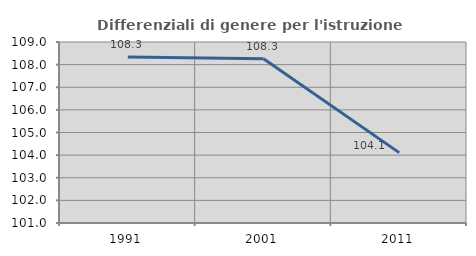
| Category | Differenziali di genere per l'istruzione superiore |
|---|---|
| 1991.0 | 108.338 |
| 2001.0 | 108.263 |
| 2011.0 | 104.11 |